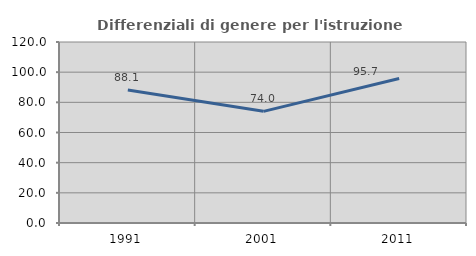
| Category | Differenziali di genere per l'istruzione superiore |
|---|---|
| 1991.0 | 88.147 |
| 2001.0 | 74.026 |
| 2011.0 | 95.746 |